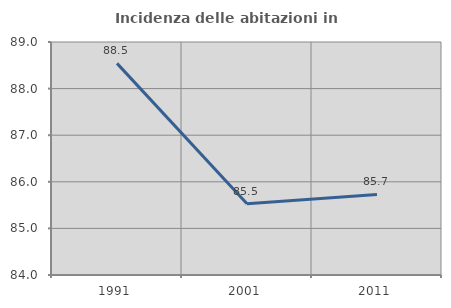
| Category | Incidenza delle abitazioni in proprietà  |
|---|---|
| 1991.0 | 88.542 |
| 2001.0 | 85.527 |
| 2011.0 | 85.728 |